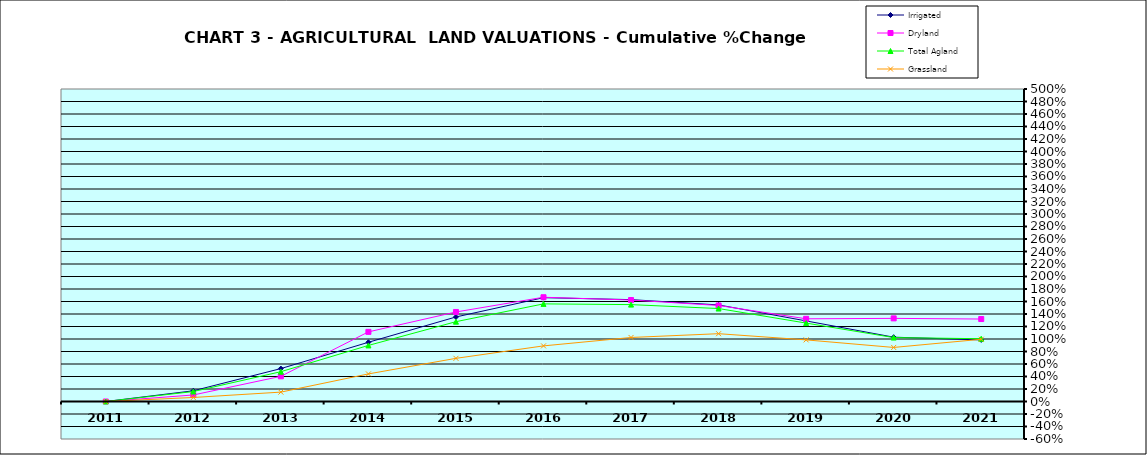
| Category | Irrigated | Dryland | Total Agland | Grassland |
|---|---|---|---|---|
| 2011.0 | 0 | 0 | 0 | 0 |
| 2012.0 | 0.171 | 0.104 | 0.159 | 0.064 |
| 2013.0 | 0.527 | 0.403 | 0.477 | 0.15 |
| 2014.0 | 0.948 | 1.114 | 0.897 | 0.441 |
| 2015.0 | 1.353 | 1.432 | 1.277 | 0.691 |
| 2016.0 | 1.661 | 1.668 | 1.562 | 0.89 |
| 2017.0 | 1.63 | 1.623 | 1.55 | 1.024 |
| 2018.0 | 1.545 | 1.536 | 1.487 | 1.085 |
| 2019.0 | 1.289 | 1.323 | 1.255 | 0.986 |
| 2020.0 | 1.029 | 1.33 | 1.023 | 0.865 |
| 2021.0 | 0.986 | 1.319 | 1.004 | 0.996 |